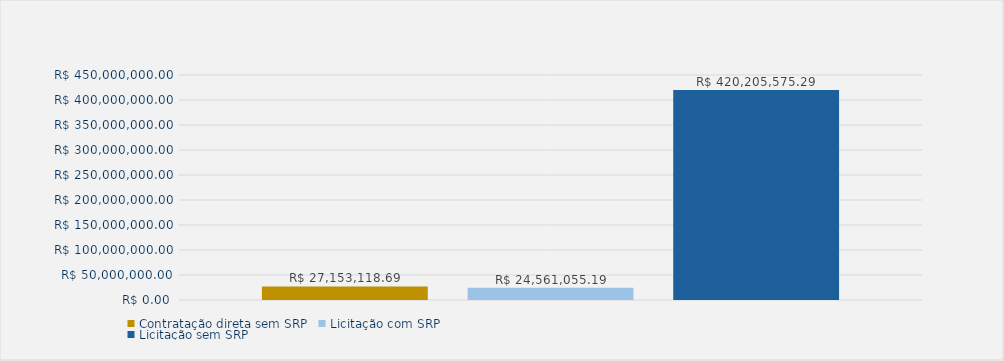
| Category | Contratação direta sem SRP | Licitação com SRP | Licitação sem SRP |
|---|---|---|---|
| Total | 27153118.69 | 24561055.19 | 420205575.29 |